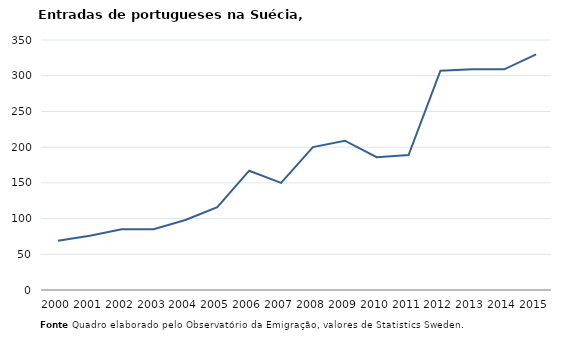
| Category | Entradas |
|---|---|
| 2000.0 | 69 |
| 2001.0 | 76 |
| 2002.0 | 85 |
| 2003.0 | 85 |
| 2004.0 | 98 |
| 2005.0 | 116 |
| 2006.0 | 167 |
| 2007.0 | 150 |
| 2008.0 | 200 |
| 2009.0 | 209 |
| 2010.0 | 186 |
| 2011.0 | 189 |
| 2012.0 | 307 |
| 2013.0 | 309 |
| 2014.0 | 309 |
| 2015.0 | 330 |